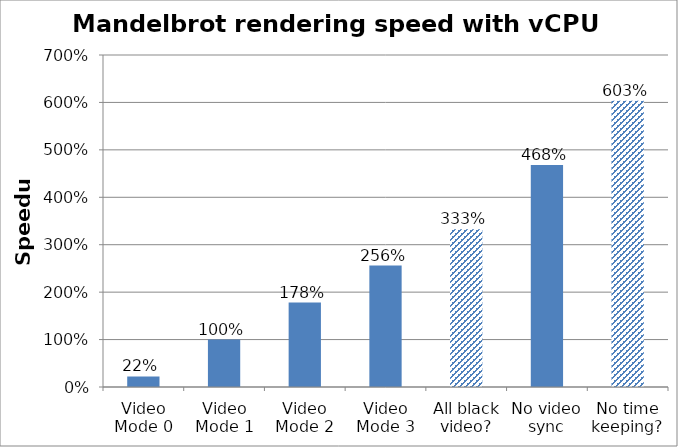
| Category | Series 0 |
|---|---|
| Video Mode 0 | 0.222 |
| Video Mode 1 | 1 |
| Video Mode 2 | 1.779 |
| Video Mode 3 | 2.559 |
| All black video? | 3.325 |
| No video sync | 4.683 |
| No time keeping? | 6.033 |